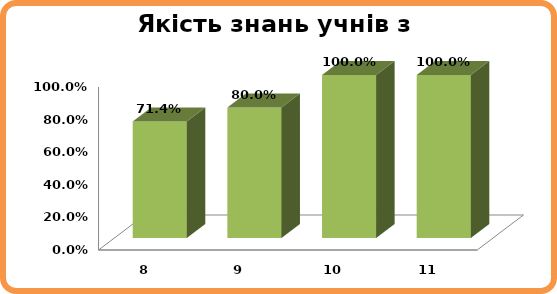
| Category | Series 0 |
|---|---|
| 8.0 | 0.714 |
| 9.0 | 0.8 |
| 10.0 | 1 |
| 11.0 | 1 |